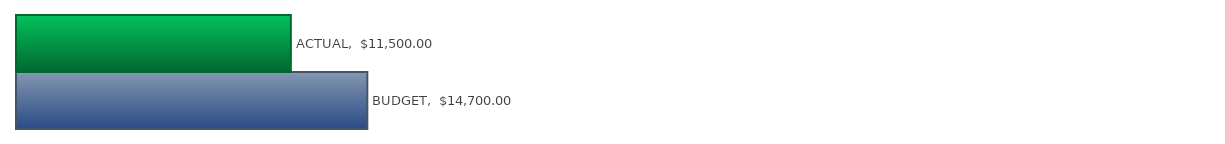
| Category | Series 0 |
|---|---|
| BUDGET | 14700 |
| ACTUAL | 11500 |